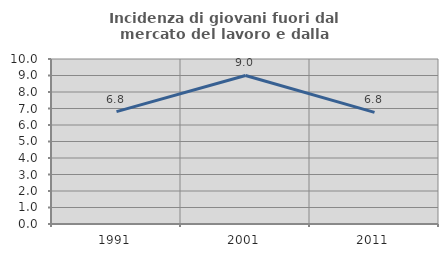
| Category | Incidenza di giovani fuori dal mercato del lavoro e dalla formazione  |
|---|---|
| 1991.0 | 6.812 |
| 2001.0 | 9.004 |
| 2011.0 | 6.762 |